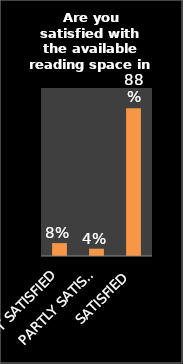
| Category | Series 0 |
|---|---|
| NOT SATISFIED | 0.077 |
| PARTLY SATISFIED | 0.043 |
| SATISFIED | 0.88 |